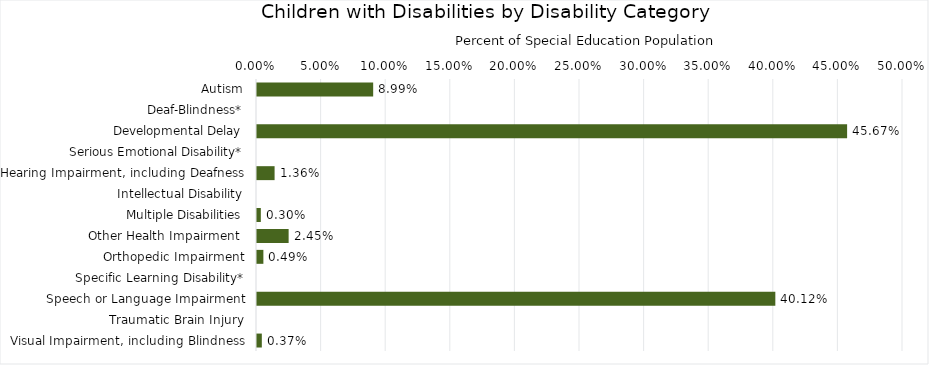
| Category | Percentage |
|---|---|
| Autism | 0.09 |
| Deaf-Blindness* | 0 |
| Developmental Delay | 0.457 |
| Serious Emotional Disability* | 0 |
| Hearing Impairment, including Deafness | 0.014 |
| Intellectual Disability | 0 |
| Multiple Disabilities | 0.003 |
| Other Health Impairment  | 0.024 |
| Orthopedic Impairment | 0.005 |
| Specific Learning Disability* | 0 |
| Speech or Language Impairment | 0.401 |
| Traumatic Brain Injury | 0 |
| Visual Impairment, including Blindness | 0.004 |